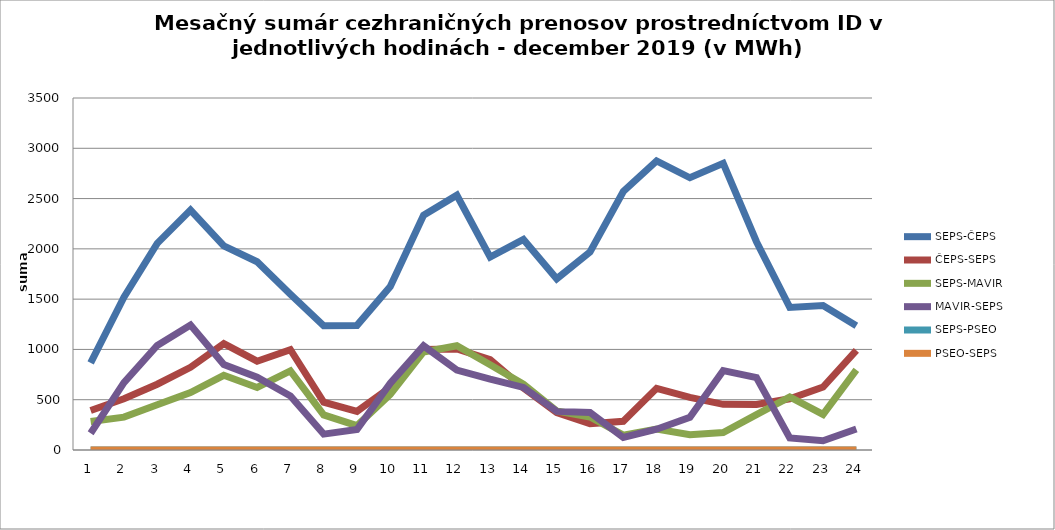
| Category | SEPS-ČEPS | ČEPS-SEPS | SEPS-MAVIR | MAVIR-SEPS | SEPS-PSEO | PSEO-SEPS |
|---|---|---|---|---|---|---|
| 1.0 | 866 | 393 | 283 | 167 | 0 | 0 |
| 2.0 | 1520 | 510 | 327 | 670 | 0 | 0 |
| 3.0 | 2055 | 654 | 450 | 1039 | 0 | 0 |
| 4.0 | 2385 | 822 | 571 | 1242 | 0 | 0 |
| 5.0 | 2029 | 1058 | 743 | 849 | 0 | 0 |
| 6.0 | 1872 | 883 | 622 | 724 | 0 | 0 |
| 7.0 | 1548 | 998 | 787 | 538 | 0 | 0 |
| 8.0 | 1236 | 475 | 349 | 158 | 0 | 0 |
| 9.0 | 1239 | 384 | 242 | 204 | 0 | 0 |
| 10.0 | 1626 | 624 | 552 | 664 | 0 | 0 |
| 11.0 | 2334 | 999 | 975 | 1036 | 0 | 0 |
| 12.0 | 2533 | 1004 | 1037 | 794 | 0 | 0 |
| 13.0 | 1918 | 899 | 848 | 704 | 0 | 0 |
| 14.0 | 2094 | 617 | 655 | 622 | 0 | 0 |
| 15.0 | 1702 | 371 | 389 | 384 | 0 | 0 |
| 16.0 | 1969 | 262 | 328 | 374 | 0 | 0 |
| 17.0 | 2570 | 285 | 148 | 125 | 0 | 0 |
| 18.0 | 2874 | 613 | 209 | 207 | 0 | 0 |
| 19.0 | 2707 | 523 | 152 | 326 | 0 | 0 |
| 20.0 | 2851 | 454 | 173 | 789 | 0 | 0 |
| 21.0 | 2071 | 453 | 351 | 720 | 0 | 0 |
| 22.0 | 1418 | 509 | 528 | 120 | 0 | 0 |
| 23.0 | 1436 | 626 | 354 | 92 | 0 | 0 |
| 24.0 | 1235 | 991 | 796 | 209 | 0 | 0 |